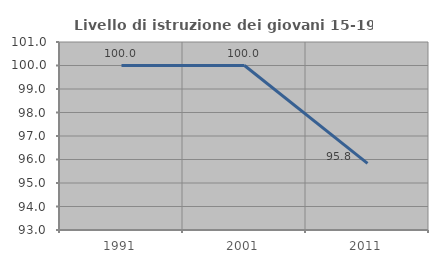
| Category | Livello di istruzione dei giovani 15-19 anni |
|---|---|
| 1991.0 | 100 |
| 2001.0 | 100 |
| 2011.0 | 95.833 |